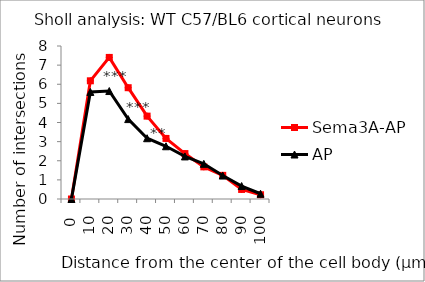
| Category | Sema3A-AP | AP |
|---|---|---|
| 0.0 | 0 | 0 |
| 10.0 | 6.181 | 5.597 |
| 20.0 | 7.403 | 5.645 |
| 30.0 | 5.819 | 4.177 |
| 40.0 | 4.333 | 3.177 |
| 50.0 | 3.167 | 2.758 |
| 60.0 | 2.375 | 2.226 |
| 70.0 | 1.681 | 1.839 |
| 80.0 | 1.236 | 1.226 |
| 90.0 | 0.5 | 0.677 |
| 100.0 | 0.222 | 0.274 |